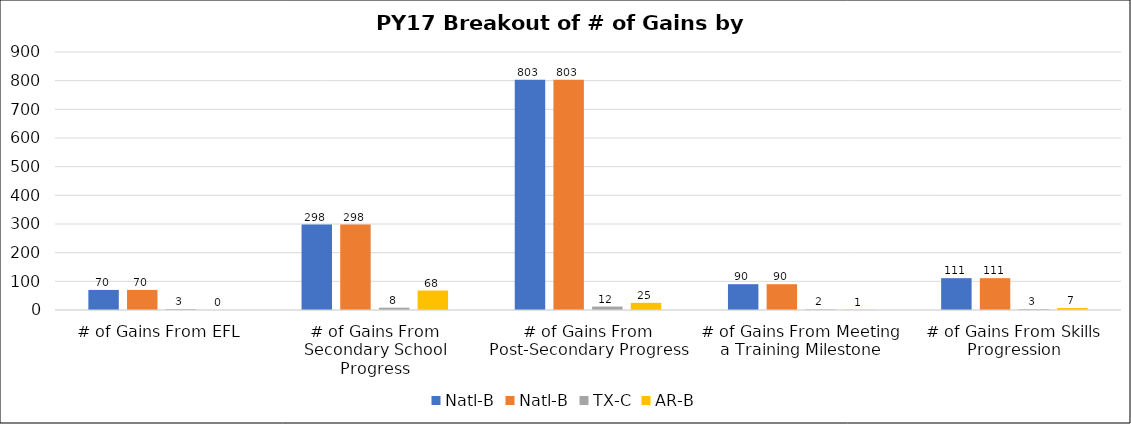
| Category | Natl-B | TX-C | AR-B |
|---|---|---|---|
| # of Gains From EFL | 70 | 3 | 0 |
| # of Gains From Secondary School Progress | 298 | 8 | 68 |
| # of Gains From Post-Secondary Progress | 803 | 12 | 25 |
| # of Gains From Meeting a Training Milestone | 90 | 2 | 1 |
| # of Gains From Skills Progression | 111 | 3 | 7 |